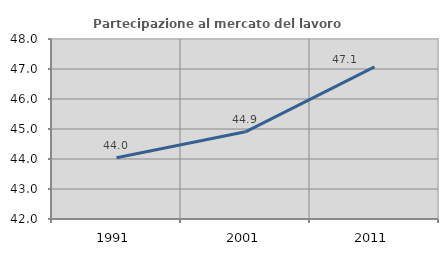
| Category | Partecipazione al mercato del lavoro  femminile |
|---|---|
| 1991.0 | 44.042 |
| 2001.0 | 44.906 |
| 2011.0 | 47.072 |